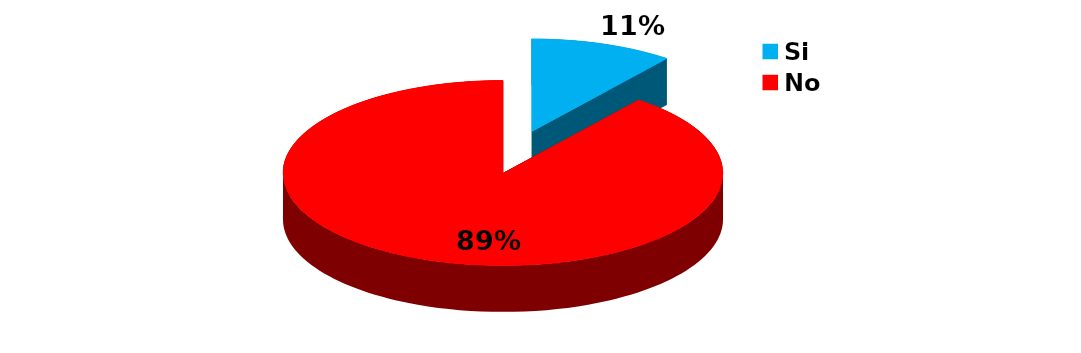
| Category | Series 0 |
|---|---|
| Si | 2 |
| No | 17 |